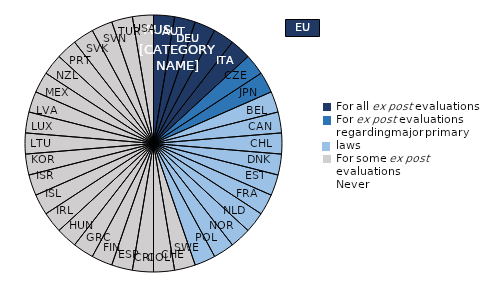
| Category | Series 0 |
|---|---|
| AUS | 1 |
| AUT | 1 |
| DEU | 1 |
| GBR | 1 |
| ITA | 1 |
| CZE | 1 |
| JPN | 1 |
| BEL | 1 |
| CAN | 1 |
| CHL | 1 |
| DNK | 1 |
| EST | 1 |
| FRA | 1 |
| NLD | 1 |
| NOR | 1 |
| POL | 1 |
| SWE | 1 |
| CHE | 1 |
| COL | 1 |
| CRI | 1 |
| ESP | 1 |
| FIN | 1 |
| GRC | 1 |
| HUN | 1 |
| IRL | 1 |
| ISL | 1 |
| ISR | 1 |
| KOR | 1 |
| LTU | 1 |
| LUX | 1 |
| LVA | 1 |
| MEX | 1 |
| NZL | 1 |
| PRT | 1 |
| SVK | 1 |
| SVN | 1 |
| TUR | 1 |
| USA | 1 |